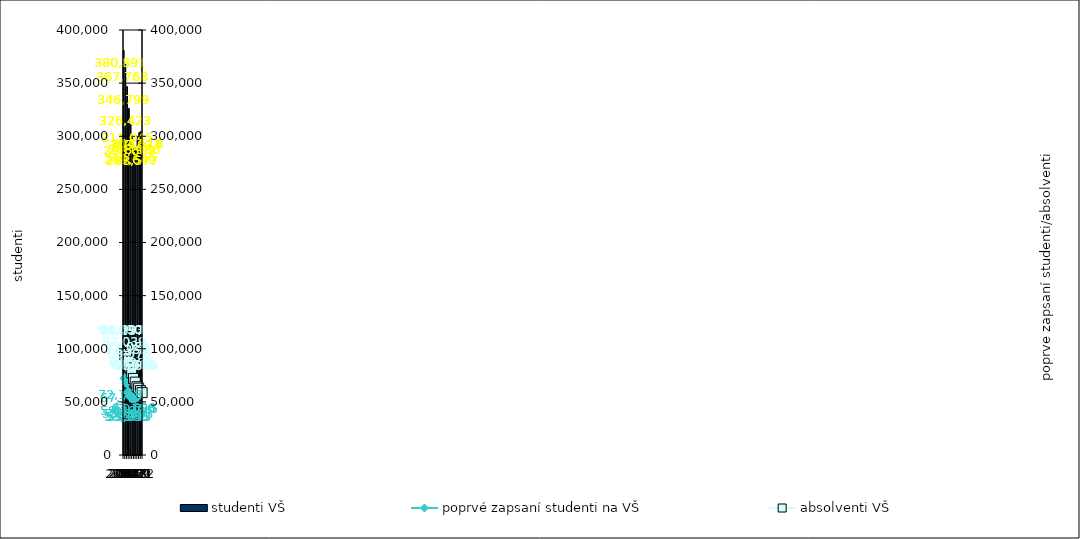
| Category | studenti VŠ |
|---|---|
| 2012.0 | 380891 |
| 2013.0 | 367768 |
| 2014.0 | 346799 |
| 2015.0 | 326423 |
| 2016.0 | 311045 |
| 2017.0 | 298663 |
| 2018.0 | 289649 |
| 2019.0 | 288577 |
| 2020.0 | 298986 |
| 2021.0 | 303633 |
| 2022.0 | 304518 |